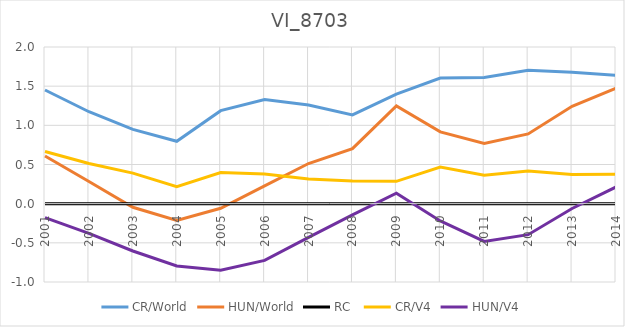
| Category | CR/World | HUN/World | RC  | CR/V4 | HUN/V4 |
|---|---|---|---|---|---|
| 2001.0 | 1.451 | 0.608 | 0 | 0.665 | -0.178 |
| 2002.0 | 1.173 | 0.282 | 0 | 0.513 | -0.378 |
| 2003.0 | 0.948 | -0.046 | 0 | 0.39 | -0.604 |
| 2004.0 | 0.797 | -0.215 | 0 | 0.216 | -0.796 |
| 2005.0 | 1.187 | -0.059 | 0 | 0.397 | -0.85 |
| 2006.0 | 1.329 | 0.228 | 0 | 0.377 | -0.724 |
| 2007.0 | 1.259 | 0.513 | 0 | 0.316 | -0.43 |
| 2008.0 | 1.133 | 0.702 | 0 | 0.289 | -0.142 |
| 2009.0 | 1.4 | 1.247 | 0 | 0.286 | 0.133 |
| 2010.0 | 1.604 | 0.916 | 0 | 0.467 | -0.221 |
| 2011.0 | 1.612 | 0.768 | 0 | 0.362 | -0.482 |
| 2012.0 | 1.704 | 0.89 | 0 | 0.417 | -0.396 |
| 2013.0 | 1.678 | 1.244 | 0 | 0.374 | -0.061 |
| 2014.0 | 1.637 | 1.474 | 0 | 0.375 | 0.212 |